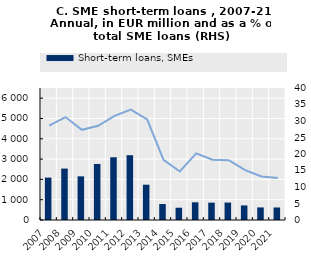
| Category | Short-term loans, SMEs |
|---|---|
| 2007.0 | 2088 |
| 2008.0 | 2532 |
| 2009.0 | 2149 |
| 2010.0 | 2760 |
| 2011.0 | 3090 |
| 2012.0 | 3191 |
| 2013.0 | 1738 |
| 2014.0 | 786 |
| 2015.0 | 605 |
| 2016.0 | 871.143 |
| 2017.0 | 854.33 |
| 2018.0 | 858.229 |
| 2019.0 | 717.153 |
| 2020.0 | 618.064 |
| 2021.0 | 616.889 |